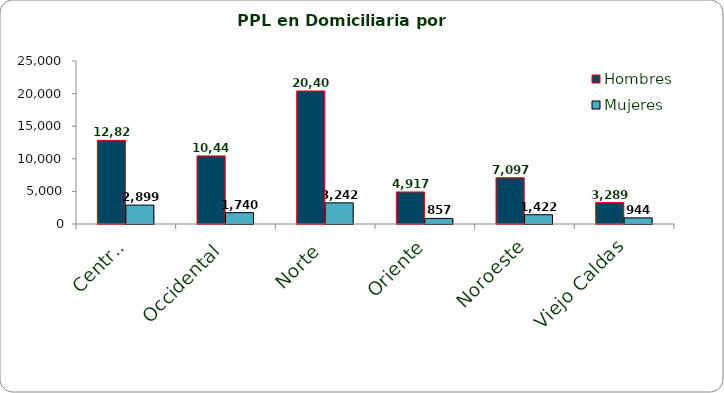
| Category | Hombres | Mujeres |
|---|---|---|
| Central | 12829 | 2899 |
| Occidental | 10448 | 1740 |
| Norte | 20400 | 3242 |
| Oriente | 4917 | 857 |
| Noroeste | 7097 | 1422 |
| Viejo Caldas | 3289 | 944 |